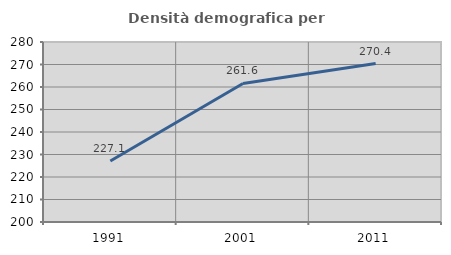
| Category | Densità demografica |
|---|---|
| 1991.0 | 227.137 |
| 2001.0 | 261.585 |
| 2011.0 | 270.405 |